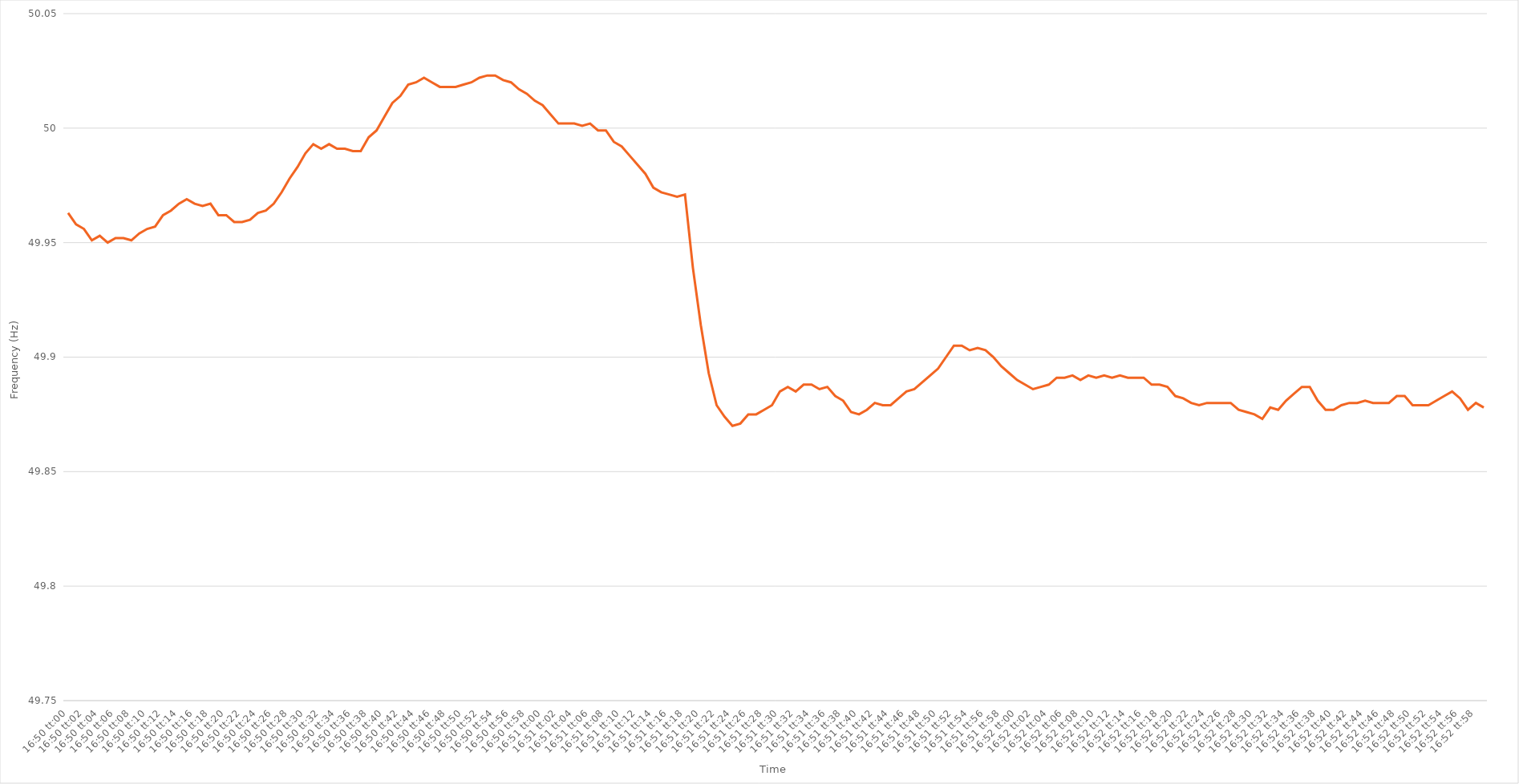
| Category | Series 0 |
|---|---|
| 0.7013888888888888 | 49.963 |
| 0.701400462962963 | 49.958 |
| 0.701412037037037 | 49.956 |
| 0.7014236111111112 | 49.951 |
| 0.7014351851851851 | 49.953 |
| 0.7014467592592593 | 49.95 |
| 0.7014583333333334 | 49.952 |
| 0.7014699074074073 | 49.952 |
| 0.7014814814814815 | 49.951 |
| 0.7014930555555555 | 49.954 |
| 0.7015046296296297 | 49.956 |
| 0.7015162037037036 | 49.957 |
| 0.7015277777777778 | 49.962 |
| 0.7015393518518519 | 49.964 |
| 0.7015509259259259 | 49.967 |
| 0.7015625 | 49.969 |
| 0.701574074074074 | 49.967 |
| 0.7015856481481482 | 49.966 |
| 0.7015972222222223 | 49.967 |
| 0.7016087962962962 | 49.962 |
| 0.7016203703703704 | 49.962 |
| 0.7016319444444444 | 49.959 |
| 0.7016435185185186 | 49.959 |
| 0.7016550925925925 | 49.96 |
| 0.7016666666666667 | 49.963 |
| 0.7016782407407408 | 49.964 |
| 0.7016898148148147 | 49.967 |
| 0.7017013888888889 | 49.972 |
| 0.7017129629629629 | 49.978 |
| 0.7017245370370371 | 49.983 |
| 0.701736111111111 | 49.989 |
| 0.7017476851851852 | 49.993 |
| 0.7017592592592593 | 49.991 |
| 0.7017708333333333 | 49.993 |
| 0.7017824074074074 | 49.991 |
| 0.7017939814814814 | 49.991 |
| 0.7018055555555556 | 49.99 |
| 0.7018171296296297 | 49.99 |
| 0.7018287037037036 | 49.996 |
| 0.7018402777777778 | 49.999 |
| 0.7018518518518518 | 50.005 |
| 0.701863425925926 | 50.011 |
| 0.7018749999999999 | 50.014 |
| 0.7018865740740741 | 50.019 |
| 0.7018981481481482 | 50.02 |
| 0.7019097222222223 | 50.022 |
| 0.7019212962962963 | 50.02 |
| 0.7019328703703703 | 50.018 |
| 0.7019444444444445 | 50.018 |
| 0.7019560185185186 | 50.018 |
| 0.7019675925925926 | 50.019 |
| 0.7019791666666667 | 50.02 |
| 0.7019907407407407 | 50.022 |
| 0.7020023148148148 | 50.023 |
| 0.7020138888888888 | 50.023 |
| 0.702025462962963 | 50.021 |
| 0.7020370370370371 | 50.02 |
| 0.702048611111111 | 50.017 |
| 0.7020601851851852 | 50.015 |
| 0.7020717592592592 | 50.012 |
| 0.7020833333333334 | 50.01 |
| 0.7020949074074073 | 50.006 |
| 0.7021064814814815 | 50.002 |
| 0.7021180555555556 | 50.002 |
| 0.7021296296296297 | 50.002 |
| 0.7021412037037037 | 50.001 |
| 0.7021527777777777 | 50.002 |
| 0.7021643518518519 | 49.999 |
| 0.702175925925926 | 49.999 |
| 0.7021875 | 49.994 |
| 0.7021990740740741 | 49.992 |
| 0.7022106481481482 | 49.988 |
| 0.7022222222222222 | 49.984 |
| 0.7022337962962962 | 49.98 |
| 0.7022453703703704 | 49.974 |
| 0.7022569444444445 | 49.972 |
| 0.7022685185185185 | 49.971 |
| 0.7022800925925926 | 49.97 |
| 0.7022916666666666 | 49.971 |
| 0.7023032407407408 | 49.939 |
| 0.7023148148148147 | 49.914 |
| 0.7023263888888889 | 49.893 |
| 0.702337962962963 | 49.879 |
| 0.7023495370370371 | 49.874 |
| 0.7023611111111111 | 49.87 |
| 0.7023726851851851 | 49.871 |
| 0.7023842592592593 | 49.875 |
| 0.7023958333333334 | 49.875 |
| 0.7024074074074074 | 49.877 |
| 0.7024189814814815 | 49.879 |
| 0.7024305555555556 | 49.885 |
| 0.7024421296296296 | 49.887 |
| 0.7024537037037036 | 49.885 |
| 0.7024652777777778 | 49.888 |
| 0.7024768518518519 | 49.888 |
| 0.7024884259259259 | 49.886 |
| 0.7025 | 49.887 |
| 0.702511574074074 | 49.883 |
| 0.7025231481481482 | 49.881 |
| 0.7025347222222221 | 49.876 |
| 0.7025462962962963 | 49.875 |
| 0.7025578703703704 | 49.877 |
| 0.7025694444444445 | 49.88 |
| 0.7025810185185185 | 49.879 |
| 0.7025925925925925 | 49.879 |
| 0.7026041666666667 | 49.882 |
| 0.7026157407407408 | 49.885 |
| 0.7026273148148148 | 49.886 |
| 0.7026388888888889 | 49.889 |
| 0.702650462962963 | 49.892 |
| 0.702662037037037 | 49.895 |
| 0.702673611111111 | 49.9 |
| 0.7026851851851852 | 49.905 |
| 0.7026967592592593 | 49.905 |
| 0.7027083333333333 | 49.903 |
| 0.7027199074074074 | 49.904 |
| 0.7027314814814815 | 49.903 |
| 0.7027430555555556 | 49.9 |
| 0.7027546296296295 | 49.896 |
| 0.7027662037037037 | 49.893 |
| 0.7027777777777778 | 49.89 |
| 0.7027893518518519 | 49.888 |
| 0.7028009259259259 | 49.886 |
| 0.7028125 | 49.887 |
| 0.7028240740740741 | 49.888 |
| 0.7028356481481483 | 49.891 |
| 0.7028472222222222 | 49.891 |
| 0.7028587962962963 | 49.892 |
| 0.7028703703703704 | 49.89 |
| 0.7028819444444444 | 49.892 |
| 0.7028935185185184 | 49.891 |
| 0.7029050925925926 | 49.892 |
| 0.7029166666666667 | 49.891 |
| 0.7029282407407407 | 49.892 |
| 0.7029398148148148 | 49.891 |
| 0.7029513888888889 | 49.891 |
| 0.702962962962963 | 49.891 |
| 0.7029745370370369 | 49.888 |
| 0.7029861111111111 | 49.888 |
| 0.7029976851851852 | 49.887 |
| 0.7030092592592593 | 49.883 |
| 0.7030208333333333 | 49.882 |
| 0.7030324074074074 | 49.88 |
| 0.7030439814814815 | 49.879 |
| 0.7030555555555557 | 49.88 |
| 0.7030671296296296 | 49.88 |
| 0.7030787037037037 | 49.88 |
| 0.7030902777777778 | 49.88 |
| 0.7031018518518519 | 49.877 |
| 0.7031134259259259 | 49.876 |
| 0.703125 | 49.875 |
| 0.7031365740740741 | 49.873 |
| 0.7031481481481481 | 49.878 |
| 0.7031597222222222 | 49.877 |
| 0.7031712962962963 | 49.881 |
| 0.7031828703703704 | 49.884 |
| 0.7031944444444443 | 49.887 |
| 0.7032060185185185 | 49.887 |
| 0.7032175925925926 | 49.881 |
| 0.7032291666666667 | 49.877 |
| 0.7032407407407407 | 49.877 |
| 0.7032523148148148 | 49.879 |
| 0.7032638888888889 | 49.88 |
| 0.7032754629629631 | 49.88 |
| 0.703287037037037 | 49.881 |
| 0.7032986111111111 | 49.88 |
| 0.7033101851851852 | 49.88 |
| 0.7033217592592593 | 49.88 |
| 0.7033333333333333 | 49.883 |
| 0.7033449074074074 | 49.883 |
| 0.7033564814814816 | 49.879 |
| 0.7033680555555556 | 49.879 |
| 0.7033796296296296 | 49.879 |
| 0.7033912037037037 | 49.881 |
| 0.7034027777777778 | 49.883 |
| 0.7034143518518517 | 49.885 |
| 0.7034259259259259 | 49.882 |
| 0.7034375 | 49.877 |
| 0.7034490740740741 | 49.88 |
| 0.7034606481481481 | 49.878 |